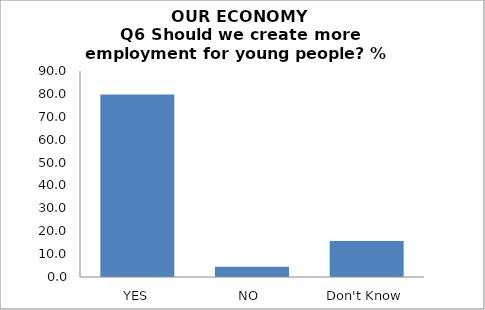
| Category | Series 0 |
|---|---|
| YES | 79.718 |
| NO  | 4.507 |
| Don't Know | 15.775 |